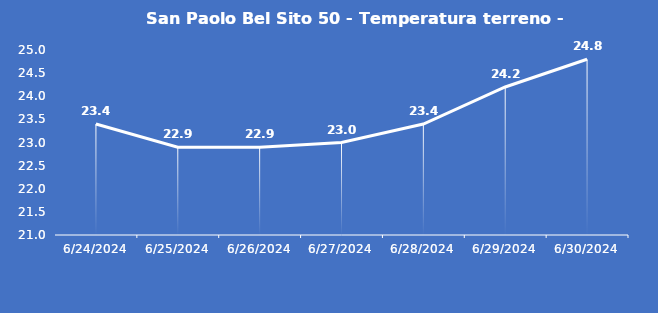
| Category | San Paolo Bel Sito 50 - Temperatura terreno - Grezzo (°C) |
|---|---|
| 6/24/24 | 23.4 |
| 6/25/24 | 22.9 |
| 6/26/24 | 22.9 |
| 6/27/24 | 23 |
| 6/28/24 | 23.4 |
| 6/29/24 | 24.2 |
| 6/30/24 | 24.8 |